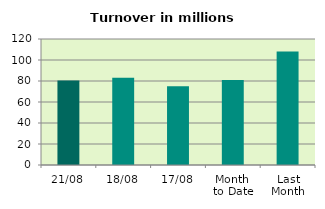
| Category | Series 0 |
|---|---|
| 21/08 | 80.582 |
| 18/08 | 83.152 |
| 17/08 | 74.903 |
| Month 
to Date | 80.941 |
| Last
Month | 108.022 |